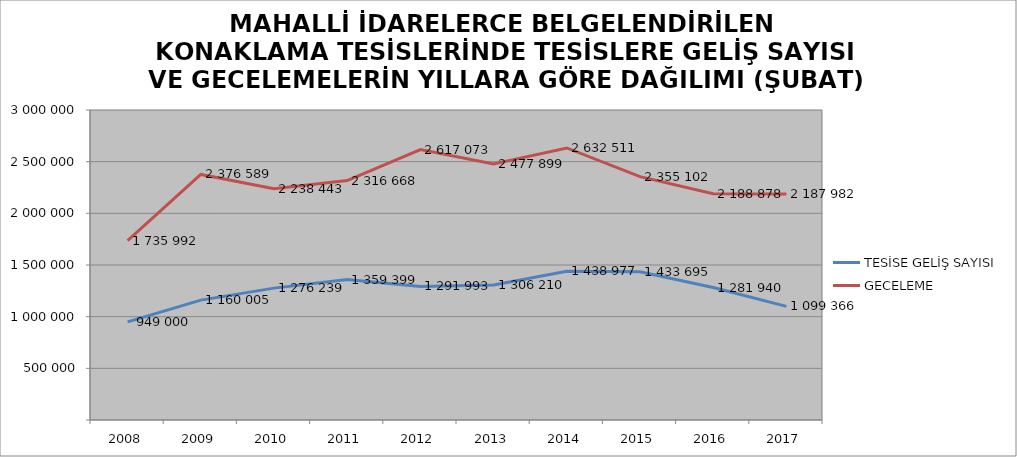
| Category | TESİSE GELİŞ SAYISI | GECELEME |
|---|---|---|
| 2008 | 949000 | 1735992 |
| 2009 | 1160005 | 2376589 |
| 2010 | 1276239 | 2238443 |
| 2011 | 1359399 | 2316668 |
| 2012 | 1291993 | 2617073 |
| 2013 | 1306210 | 2477899 |
| 2014 | 1438977 | 2632511 |
| 2015 | 1433695 | 2355102 |
| 2016 | 1281940 | 2188878 |
| 2017 | 1099366 | 2187982 |